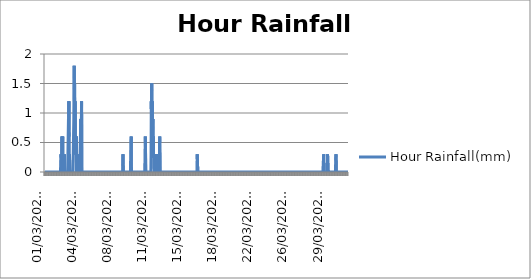
| Category | Hour Rainfall(mm) |
|---|---|
|  01/03/2022 00:20:09 | 0 |
|  01/03/2022 00:50:09 | 0 |
|  01/03/2022 01:20:09 | 0 |
|  01/03/2022 01:50:09 | 0 |
|  01/03/2022 02:20:09 | 0 |
|  01/03/2022 02:50:09 | 0 |
|  01/03/2022 03:20:09 | 0 |
|  01/03/2022 03:50:09 | 0 |
|  01/03/2022 04:20:09 | 0 |
|  01/03/2022 04:50:09 | 0 |
|  01/03/2022 05:20:09 | 0 |
|  01/03/2022 05:50:09 | 0 |
|  01/03/2022 06:20:09 | 0 |
|  01/03/2022 06:50:09 | 0 |
|  01/03/2022 07:20:09 | 0 |
|  01/03/2022 07:50:09 | 0 |
|  01/03/2022 08:20:09 | 0 |
|  01/03/2022 08:50:09 | 0 |
|  01/03/2022 09:20:09 | 0 |
|  01/03/2022 09:50:09 | 0 |
|  01/03/2022 10:20:09 | 0 |
|  01/03/2022 10:50:09 | 0 |
|  01/03/2022 11:20:09 | 0 |
|  01/03/2022 11:50:09 | 0 |
|  01/03/2022 12:20:09 | 0 |
|  01/03/2022 12:50:09 | 0 |
|  01/03/2022 15:54:06 | 0 |
|  01/03/2022 16:24:06 | 0 |
|  01/03/2022 16:54:06 | 0 |
|  01/03/2022 17:24:06 | 0 |
|  01/03/2022 17:54:06 | 0 |
|  01/03/2022 18:24:06 | 0 |
|  01/03/2022 18:54:06 | 0 |
|  01/03/2022 19:24:06 | 0 |
|  01/03/2022 19:54:06 | 0 |
|  01/03/2022 20:24:06 | 0 |
|  01/03/2022 20:54:06 | 0 |
|  01/03/2022 21:24:06 | 0 |
|  01/03/2022 21:54:06 | 0 |
|  01/03/2022 22:24:06 | 0 |
|  01/03/2022 22:54:06 | 0 |
|  01/03/2022 23:24:06 | 0 |
|  01/03/2022 23:54:06 | 0 |
|  02/03/2022 00:24:06 | 0 |
|  02/03/2022 00:54:06 | 0 |
|  02/03/2022 01:24:06 | 0 |
|  02/03/2022 01:54:06 | 0 |
|  02/03/2022 02:24:06 | 0 |
|  02/03/2022 02:54:06 | 0 |
|  02/03/2022 03:24:06 | 0 |
|  02/03/2022 03:54:06 | 0 |
|  02/03/2022 04:24:06 | 0 |
|  02/03/2022 04:54:06 | 0 |
|  02/03/2022 05:24:06 | 0 |
|  02/03/2022 05:54:06 | 0 |
|  02/03/2022 06:24:06 | 0 |
|  02/03/2022 06:54:06 | 0 |
|  02/03/2022 07:24:06 | 0 |
|  02/03/2022 07:54:06 | 0 |
|  02/03/2022 08:24:06 | 0 |
|  02/03/2022 08:54:06 | 0 |
|  02/03/2022 09:24:06 | 0 |
|  02/03/2022 09:54:06 | 0 |
|  02/03/2022 10:24:06 | 0 |
|  02/03/2022 10:54:06 | 0 |
|  02/03/2022 11:24:06 | 0 |
|  02/03/2022 11:54:06 | 0 |
|  02/03/2022 12:24:06 | 0 |
|  02/03/2022 12:54:06 | 0 |
|  02/03/2022 13:24:06 | 0 |
|  02/03/2022 13:54:06 | 0 |
|  02/03/2022 14:24:06 | 0 |
|  02/03/2022 14:54:06 | 0 |
|  02/03/2022 15:24:06 | 0 |
|  02/03/2022 15:54:06 | 0 |
|  02/03/2022 16:24:06 | 0 |
|  02/03/2022 16:54:06 | 0 |
|  02/03/2022 17:24:06 | 0 |
|  02/03/2022 17:54:06 | 0.3 |
|  02/03/2022 18:24:06 | 0 |
|  02/03/2022 18:54:06 | 0 |
|  02/03/2022 19:24:06 | 0.3 |
|  02/03/2022 19:54:06 | 0.6 |
|  02/03/2022 20:24:06 | 0 |
|  02/03/2022 20:54:06 | 0.3 |
|  02/03/2022 21:24:06 | 0.3 |
|  02/03/2022 21:54:06 | 0.6 |
|  02/03/2022 22:24:06 | 0 |
|  02/03/2022 22:54:06 | 0 |
|  02/03/2022 23:24:06 | 0 |
|  02/03/2022 23:54:06 | 0 |
|  03/03/2022 00:24:06 | 0 |
|  03/03/2022 00:54:06 | 0 |
|  03/03/2022 01:24:06 | 0 |
|  03/03/2022 01:54:06 | 0.3 |
|  03/03/2022 02:24:06 | 0 |
|  03/03/2022 02:54:06 | 0 |
|  03/03/2022 03:24:06 | 0 |
|  03/03/2022 03:54:06 | 0 |
|  03/03/2022 04:24:06 | 0 |
|  03/03/2022 04:54:06 | 0 |
|  03/03/2022 05:24:06 | 0 |
|  03/03/2022 05:54:06 | 0 |
|  03/03/2022 06:24:06 | 0 |
|  03/03/2022 06:54:06 | 0 |
|  03/03/2022 07:24:06 | 0 |
|  03/03/2022 07:54:06 | 0 |
|  03/03/2022 08:24:06 | 0 |
|  03/03/2022 08:54:06 | 0 |
|  03/03/2022 09:24:06 | 0 |
|  03/03/2022 09:54:06 | 0 |
|  03/03/2022 10:24:06 | 0 |
|  03/03/2022 10:54:06 | 0 |
|  03/03/2022 11:24:06 | 0 |
|  03/03/2022 11:54:06 | 0.9 |
|  03/03/2022 12:24:06 | 0.6 |
|  03/03/2022 12:54:06 | 1.2 |
|  03/03/2022 13:24:06 | 0 |
|  03/03/2022 13:54:06 | 0 |
|  03/03/2022 14:24:06 | 0.3 |
|  03/03/2022 14:54:06 | 0.3 |
|  03/03/2022 15:24:06 | 0 |
|  03/03/2022 15:54:06 | 0 |
|  03/03/2022 16:24:06 | 0 |
|  03/03/2022 16:54:06 | 0 |
|  03/03/2022 17:24:06 | 0 |
|  03/03/2022 17:54:06 | 0 |
|  03/03/2022 18:24:06 | 0 |
|  03/03/2022 18:54:06 | 0 |
|  03/03/2022 19:24:06 | 0 |
|  03/03/2022 19:54:06 | 0 |
|  03/03/2022 20:24:06 | 0 |
|  03/03/2022 20:54:06 | 0 |
|  03/03/2022 21:24:06 | 0 |
|  03/03/2022 21:54:06 | 0 |
|  03/03/2022 22:24:06 | 0 |
|  03/03/2022 22:54:06 | 0 |
|  03/03/2022 23:24:06 | 0 |
|  03/03/2022 23:54:06 | 0 |
|  04/03/2022 00:24:06 | 0 |
|  04/03/2022 00:54:06 | 0.9 |
|  04/03/2022 01:24:06 | 0.9 |
|  04/03/2022 01:54:06 | 1.8 |
|  04/03/2022 02:24:06 | 1.2 |
|  04/03/2022 02:54:06 | 1.5 |
|  04/03/2022 03:24:06 | 0.3 |
|  04/03/2022 03:54:06 | 1.2 |
|  04/03/2022 04:24:06 | 0.6 |
|  04/03/2022 04:54:06 | 0.6 |
|  04/03/2022 05:24:06 | 0.3 |
|  04/03/2022 05:54:06 | 0.6 |
|  04/03/2022 06:24:06 | 0.3 |
|  04/03/2022 06:54:06 | 0.6 |
|  04/03/2022 07:24:06 | 0 |
|  04/03/2022 07:54:06 | 0.3 |
|  04/03/2022 08:24:06 | 0 |
|  04/03/2022 08:54:06 | 0 |
|  04/03/2022 09:24:06 | 0 |
|  04/03/2022 09:54:06 | 0.3 |
|  04/03/2022 10:24:06 | 0 |
|  04/03/2022 10:54:06 | 0 |
|  04/03/2022 11:24:06 | 0 |
|  04/03/2022 11:54:06 | 0 |
|  04/03/2022 12:24:06 | 0 |
|  04/03/2022 12:54:06 | 0 |
|  04/03/2022 13:24:06 | 0 |
|  04/03/2022 13:54:06 | 0 |
|  04/03/2022 14:24:06 | 0 |
|  04/03/2022 14:54:06 | 0 |
|  04/03/2022 15:24:06 | 0 |
|  04/03/2022 15:54:06 | 0 |
|  04/03/2022 16:24:06 | 0 |
|  04/03/2022 16:54:06 | 0 |
|  04/03/2022 17:24:06 | 0 |
|  04/03/2022 17:54:06 | 0.9 |
|  04/03/2022 18:24:06 | 0.3 |
|  04/03/2022 18:54:06 | 0.3 |
|  04/03/2022 19:24:06 | 0.9 |
|  04/03/2022 19:54:06 | 1.2 |
|  04/03/2022 20:24:06 | 0 |
|  04/03/2022 20:54:06 | 0 |
|  04/03/2022 21:24:06 | 0 |
|  04/03/2022 21:54:06 | 0 |
|  04/03/2022 22:24:06 | 0 |
|  04/03/2022 22:54:06 | 0 |
|  04/03/2022 23:24:06 | 0 |
|  04/03/2022 23:54:06 | 0 |
|  05/03/2022 00:24:06 | 0 |
|  05/03/2022 00:54:06 | 0 |
|  05/03/2022 01:24:06 | 0 |
|  05/03/2022 01:54:06 | 0 |
|  05/03/2022 02:24:06 | 0 |
|  05/03/2022 02:54:06 | 0 |
|  05/03/2022 03:24:06 | 0 |
|  05/03/2022 03:54:06 | 0 |
|  05/03/2022 04:24:06 | 0 |
|  05/03/2022 04:54:06 | 0 |
|  05/03/2022 05:24:06 | 0 |
|  05/03/2022 05:54:06 | 0 |
|  05/03/2022 06:24:06 | 0 |
|  05/03/2022 06:54:06 | 0 |
|  05/03/2022 07:24:06 | 0 |
|  05/03/2022 07:54:06 | 0 |
|  05/03/2022 08:24:06 | 0 |
|  05/03/2022 08:54:06 | 0 |
|  05/03/2022 09:24:06 | 0 |
|  05/03/2022 09:54:06 | 0 |
|  05/03/2022 10:24:06 | 0 |
|  05/03/2022 10:54:06 | 0 |
|  05/03/2022 11:24:06 | 0 |
|  05/03/2022 11:54:06 | 0 |
|  05/03/2022 12:24:06 | 0 |
|  05/03/2022 12:54:06 | 0 |
|  05/03/2022 13:24:06 | 0 |
|  05/03/2022 13:54:06 | 0 |
|  05/03/2022 14:24:06 | 0 |
|  05/03/2022 14:54:06 | 0 |
|  05/03/2022 15:24:06 | 0 |
|  05/03/2022 15:54:06 | 0 |
|  05/03/2022 16:24:06 | 0 |
|  05/03/2022 16:54:06 | 0 |
|  05/03/2022 17:24:06 | 0 |
|  05/03/2022 17:54:06 | 0 |
|  05/03/2022 18:24:06 | 0 |
|  05/03/2022 18:54:06 | 0 |
|  05/03/2022 19:24:06 | 0 |
|  05/03/2022 19:54:06 | 0 |
|  05/03/2022 20:24:06 | 0 |
|  05/03/2022 20:54:06 | 0 |
|  05/03/2022 21:24:06 | 0 |
|  05/03/2022 21:54:06 | 0 |
|  05/03/2022 22:24:06 | 0 |
|  05/03/2022 22:54:06 | 0 |
|  05/03/2022 23:24:06 | 0 |
|  05/03/2022 23:54:06 | 0 |
|  06/03/2022 00:24:06 | 0 |
|  06/03/2022 00:54:06 | 0 |
|  06/03/2022 01:24:06 | 0 |
|  06/03/2022 01:54:06 | 0 |
|  06/03/2022 02:24:06 | 0 |
|  06/03/2022 02:54:06 | 0 |
|  06/03/2022 03:24:06 | 0 |
|  06/03/2022 03:54:06 | 0 |
|  06/03/2022 04:24:06 | 0 |
|  06/03/2022 04:54:06 | 0 |
|  06/03/2022 05:24:06 | 0 |
|  06/03/2022 05:54:06 | 0 |
|  06/03/2022 06:24:06 | 0 |
|  06/03/2022 06:54:06 | 0 |
|  06/03/2022 07:24:06 | 0 |
|  06/03/2022 07:54:06 | 0 |
|  06/03/2022 08:24:06 | 0 |
|  06/03/2022 08:54:06 | 0 |
|  06/03/2022 09:24:06 | 0 |
|  06/03/2022 09:54:06 | 0 |
|  06/03/2022 10:24:06 | 0 |
|  06/03/2022 10:54:06 | 0 |
|  06/03/2022 11:24:06 | 0 |
|  06/03/2022 11:54:06 | 0 |
|  06/03/2022 12:24:06 | 0 |
|  06/03/2022 12:54:06 | 0 |
|  06/03/2022 13:24:06 | 0 |
|  06/03/2022 13:54:06 | 0 |
|  06/03/2022 14:24:06 | 0 |
|  06/03/2022 14:54:06 | 0 |
|  06/03/2022 15:24:06 | 0 |
|  06/03/2022 15:54:06 | 0 |
|  06/03/2022 16:24:06 | 0 |
|  06/03/2022 16:54:06 | 0 |
|  06/03/2022 17:24:06 | 0 |
|  06/03/2022 17:54:06 | 0 |
|  06/03/2022 18:24:06 | 0 |
|  06/03/2022 18:54:06 | 0 |
|  06/03/2022 19:24:06 | 0 |
|  06/03/2022 19:54:06 | 0 |
|  06/03/2022 20:24:06 | 0 |
|  06/03/2022 20:54:06 | 0 |
|  06/03/2022 21:24:06 | 0 |
|  06/03/2022 21:54:06 | 0 |
|  06/03/2022 22:24:06 | 0 |
|  06/03/2022 22:54:06 | 0 |
|  06/03/2022 23:24:06 | 0 |
|  06/03/2022 23:54:06 | 0 |
|  07/03/2022 00:24:06 | 0 |
|  07/03/2022 00:54:06 | 0 |
|  07/03/2022 01:24:06 | 0 |
|  07/03/2022 01:54:06 | 0 |
|  07/03/2022 02:24:06 | 0 |
|  07/03/2022 02:54:06 | 0 |
|  07/03/2022 03:24:06 | 0 |
|  07/03/2022 03:54:06 | 0 |
|  07/03/2022 04:24:06 | 0 |
|  07/03/2022 04:54:06 | 0 |
|  07/03/2022 05:24:06 | 0 |
|  07/03/2022 05:54:06 | 0 |
|  07/03/2022 06:24:06 | 0 |
|  07/03/2022 06:54:06 | 0 |
|  07/03/2022 07:24:06 | 0 |
|  07/03/2022 07:54:06 | 0 |
|  07/03/2022 08:24:06 | 0 |
|  07/03/2022 08:54:06 | 0 |
|  07/03/2022 09:24:06 | 0 |
|  07/03/2022 09:54:06 | 0 |
|  07/03/2022 10:24:06 | 0 |
|  07/03/2022 10:54:06 | 0 |
|  07/03/2022 11:24:06 | 0 |
|  07/03/2022 11:54:06 | 0 |
|  07/03/2022 12:24:06 | 0 |
|  07/03/2022 12:54:06 | 0 |
|  07/03/2022 13:24:06 | 0 |
|  07/03/2022 13:54:06 | 0 |
|  07/03/2022 14:24:06 | 0 |
|  07/03/2022 14:54:06 | 0 |
|  07/03/2022 15:24:06 | 0 |
|  07/03/2022 15:54:06 | 0 |
|  07/03/2022 16:24:06 | 0 |
|  07/03/2022 16:54:06 | 0 |
|  07/03/2022 17:24:06 | 0 |
|  07/03/2022 17:54:06 | 0 |
|  07/03/2022 18:24:06 | 0 |
|  07/03/2022 18:54:06 | 0 |
|  07/03/2022 19:24:06 | 0 |
|  07/03/2022 19:54:06 | 0 |
|  07/03/2022 20:24:06 | 0 |
|  07/03/2022 20:54:06 | 0 |
|  07/03/2022 21:24:06 | 0 |
|  07/03/2022 21:54:06 | 0 |
|  07/03/2022 22:24:06 | 0 |
|  07/03/2022 22:54:06 | 0 |
|  07/03/2022 23:24:06 | 0 |
|  07/03/2022 23:54:06 | 0 |
|  08/03/2022 00:24:06 | 0 |
|  08/03/2022 00:54:06 | 0 |
|  08/03/2022 01:24:06 | 0 |
|  08/03/2022 01:54:06 | 0 |
|  08/03/2022 02:24:06 | 0 |
|  08/03/2022 02:54:06 | 0 |
|  08/03/2022 03:24:06 | 0 |
|  08/03/2022 03:54:06 | 0 |
|  08/03/2022 04:24:06 | 0 |
|  08/03/2022 04:54:06 | 0 |
|  08/03/2022 05:24:06 | 0 |
|  08/03/2022 05:54:06 | 0 |
|  08/03/2022 06:24:06 | 0 |
|  08/03/2022 06:54:06 | 0 |
|  08/03/2022 07:24:06 | 0 |
|  08/03/2022 07:54:06 | 0 |
|  08/03/2022 08:24:06 | 0 |
|  08/03/2022 08:54:06 | 0 |
|  08/03/2022 09:24:06 | 0 |
|  08/03/2022 09:54:06 | 0 |
|  08/03/2022 10:24:06 | 0 |
|  08/03/2022 10:54:06 | 0 |
|  08/03/2022 11:24:06 | 0 |
|  08/03/2022 11:54:06 | 0 |
|  08/03/2022 12:24:06 | 0 |
|  08/03/2022 12:54:06 | 0 |
|  08/03/2022 13:24:06 | 0 |
|  08/03/2022 13:54:06 | 0 |
|  08/03/2022 14:24:06 | 0 |
|  08/03/2022 14:54:06 | 0 |
|  08/03/2022 15:24:06 | 0 |
|  08/03/2022 15:54:06 | 0 |
|  08/03/2022 16:24:06 | 0 |
|  08/03/2022 16:54:06 | 0 |
|  08/03/2022 17:24:06 | 0 |
|  08/03/2022 17:54:06 | 0 |
|  08/03/2022 18:24:06 | 0 |
|  08/03/2022 18:54:06 | 0 |
|  08/03/2022 19:24:06 | 0 |
|  08/03/2022 19:54:06 | 0 |
|  08/03/2022 20:24:06 | 0 |
|  08/03/2022 20:54:06 | 0 |
|  08/03/2022 21:24:06 | 0 |
|  08/03/2022 21:54:06 | 0 |
|  08/03/2022 22:24:06 | 0 |
|  08/03/2022 22:54:06 | 0 |
|  08/03/2022 23:24:06 | 0 |
|  08/03/2022 23:54:06 | 0 |
|  09/03/2022 00:24:06 | 0 |
|  09/03/2022 00:54:06 | 0.3 |
|  09/03/2022 01:24:06 | 0 |
|  09/03/2022 01:54:06 | 0 |
|  09/03/2022 02:24:06 | 0 |
|  09/03/2022 02:54:06 | 0 |
|  09/03/2022 03:24:06 | 0 |
|  09/03/2022 03:54:06 | 0 |
|  09/03/2022 04:24:06 | 0 |
|  09/03/2022 04:54:06 | 0 |
|  09/03/2022 05:24:06 | 0 |
|  09/03/2022 05:54:06 | 0 |
|  09/03/2022 06:24:06 | 0 |
|  09/03/2022 06:54:06 | 0 |
|  09/03/2022 07:24:06 | 0 |
|  09/03/2022 07:54:06 | 0 |
|  09/03/2022 08:24:06 | 0 |
|  09/03/2022 08:54:06 | 0 |
|  09/03/2022 09:24:06 | 0 |
|  09/03/2022 09:54:06 | 0 |
|  09/03/2022 10:24:06 | 0 |
|  09/03/2022 10:54:06 | 0 |
|  09/03/2022 11:24:06 | 0 |
|  09/03/2022 11:54:06 | 0 |
|  09/03/2022 12:24:06 | 0 |
|  09/03/2022 12:54:06 | 0 |
|  09/03/2022 13:24:06 | 0 |
|  09/03/2022 13:54:06 | 0 |
|  09/03/2022 14:24:06 | 0 |
|  09/03/2022 14:54:06 | 0 |
|  09/03/2022 15:24:06 | 0 |
|  09/03/2022 15:54:06 | 0 |
|  09/03/2022 16:24:06 | 0 |
|  09/03/2022 16:54:06 | 0 |
|  09/03/2022 17:24:06 | 0 |
|  09/03/2022 17:54:06 | 0 |
|  09/03/2022 18:24:06 | 0 |
|  09/03/2022 18:54:06 | 0 |
|  09/03/2022 19:24:06 | 0 |
|  09/03/2022 19:54:06 | 0 |
|  09/03/2022 20:24:06 | 0 |
|  09/03/2022 20:54:06 | 0.6 |
|  09/03/2022 21:24:06 | 0 |
|  09/03/2022 21:54:06 | 0 |
|  09/03/2022 22:24:06 | 0 |
|  09/03/2022 22:54:06 | 0 |
|  09/03/2022 23:24:06 | 0 |
|  09/03/2022 23:54:06 | 0 |
|  10/03/2022 00:24:06 | 0 |
|  10/03/2022 00:54:06 | 0 |
|  10/03/2022 01:24:06 | 0 |
|  10/03/2022 01:54:06 | 0 |
|  10/03/2022 02:24:06 | 0 |
|  10/03/2022 02:54:06 | 0 |
|  10/03/2022 03:24:06 | 0 |
|  10/03/2022 03:54:06 | 0 |
|  10/03/2022 04:24:06 | 0 |
|  10/03/2022 04:54:06 | 0 |
|  10/03/2022 05:24:06 | 0 |
|  10/03/2022 05:54:06 | 0 |
|  10/03/2022 06:24:06 | 0 |
|  10/03/2022 06:54:06 | 0 |
|  10/03/2022 07:24:06 | 0 |
|  10/03/2022 07:54:06 | 0 |
|  10/03/2022 08:24:06 | 0 |
|  10/03/2022 08:54:06 | 0 |
|  10/03/2022 09:24:06 | 0 |
|  10/03/2022 09:54:06 | 0 |
|  10/03/2022 10:24:06 | 0 |
|  10/03/2022 10:54:06 | 0 |
|  10/03/2022 11:24:06 | 0 |
|  10/03/2022 11:54:06 | 0 |
|  10/03/2022 12:24:06 | 0 |
|  10/03/2022 12:54:06 | 0 |
|  10/03/2022 13:24:06 | 0 |
|  10/03/2022 13:54:06 | 0 |
|  10/03/2022 14:24:06 | 0 |
|  10/03/2022 14:54:06 | 0 |
|  10/03/2022 15:24:06 | 0 |
|  10/03/2022 15:54:06 | 0 |
|  10/03/2022 16:24:06 | 0 |
|  10/03/2022 16:54:06 | 0 |
|  10/03/2022 17:24:06 | 0 |
|  10/03/2022 17:54:06 | 0 |
|  10/03/2022 18:24:06 | 0 |
|  10/03/2022 18:54:06 | 0 |
|  10/03/2022 19:24:06 | 0 |
|  10/03/2022 19:54:06 | 0 |
|  10/03/2022 20:24:06 | 0 |
|  10/03/2022 20:54:06 | 0 |
|  10/03/2022 21:24:06 | 0 |
|  10/03/2022 21:54:06 | 0 |
|  10/03/2022 22:24:06 | 0 |
|  10/03/2022 22:54:06 | 0 |
|  10/03/2022 23:24:06 | 0 |
|  10/03/2022 23:54:06 | 0 |
|  11/03/2022 00:24:06 | 0 |
|  11/03/2022 00:54:06 | 0 |
|  11/03/2022 01:24:06 | 0 |
|  11/03/2022 01:54:06 | 0 |
|  11/03/2022 02:24:06 | 0 |
|  11/03/2022 02:54:06 | 0 |
|  11/03/2022 03:24:06 | 0 |
|  11/03/2022 03:54:06 | 0 |
|  11/03/2022 04:24:06 | 0 |
|  11/03/2022 04:54:06 | 0 |
|  11/03/2022 05:24:06 | 0 |
|  11/03/2022 05:54:06 | 0 |
|  11/03/2022 06:24:06 | 0 |
|  11/03/2022 06:54:06 | 0 |
|  11/03/2022 07:24:06 | 0.6 |
|  11/03/2022 07:54:06 | 0.6 |
|  11/03/2022 08:24:06 | 0 |
|  11/03/2022 08:54:06 | 0 |
|  11/03/2022 09:24:06 | 0 |
|  11/03/2022 09:54:06 | 0 |
|  11/03/2022 10:24:06 | 0 |
|  11/03/2022 10:54:06 | 0 |
|  11/03/2022 11:24:06 | 0 |
|  11/03/2022 11:54:06 | 0 |
|  11/03/2022 12:24:06 | 0 |
|  11/03/2022 12:54:06 | 0 |
|  11/03/2022 13:24:06 | 0 |
|  11/03/2022 13:54:06 | 0 |
|  11/03/2022 14:24:06 | 0 |
|  11/03/2022 14:54:06 | 0 |
|  11/03/2022 15:24:06 | 0 |
|  11/03/2022 15:54:06 | 0 |
|  11/03/2022 16:24:06 | 0 |
|  11/03/2022 16:54:06 | 0 |
|  11/03/2022 17:24:06 | 0 |
|  11/03/2022 17:54:06 | 0 |
|  11/03/2022 18:24:06 | 0 |
|  11/03/2022 18:54:06 | 0 |
|  11/03/2022 19:24:06 | 0 |
|  11/03/2022 19:54:06 | 0 |
|  11/03/2022 20:24:06 | 0 |
|  11/03/2022 20:54:06 | 0 |
|  11/03/2022 21:24:06 | 0.3 |
|  11/03/2022 21:54:06 | 1.2 |
|  11/03/2022 22:24:06 | 0.9 |
|  11/03/2022 22:54:06 | 1.5 |
|  11/03/2022 23:24:06 | 0.6 |
|  11/03/2022 23:54:06 | 1.2 |
|  12/03/2022 00:24:06 | 0.3 |
|  12/03/2022 00:54:06 | 0.6 |
|  12/03/2022 01:24:06 | 0.6 |
|  12/03/2022 01:54:06 | 0.9 |
|  12/03/2022 02:24:06 | 0.3 |
|  12/03/2022 02:54:06 | 0.6 |
|  12/03/2022 03:24:06 | 0.3 |
|  12/03/2022 03:54:06 | 0.3 |
|  12/03/2022 04:24:06 | 0 |
|  12/03/2022 04:54:06 | 0 |
|  12/03/2022 05:24:06 | 0 |
|  12/03/2022 05:54:06 | 0 |
|  12/03/2022 06:24:06 | 0 |
|  12/03/2022 06:54:06 | 0 |
|  12/03/2022 07:24:06 | 0 |
|  12/03/2022 07:54:06 | 0 |
|  12/03/2022 08:24:06 | 0 |
|  12/03/2022 08:54:06 | 0 |
|  12/03/2022 09:24:06 | 0 |
|  12/03/2022 09:54:06 | 0.3 |
|  12/03/2022 10:24:06 | 0 |
|  12/03/2022 10:54:06 | 0 |
|  12/03/2022 11:24:06 | 0.3 |
|  12/03/2022 11:54:06 | 0.3 |
|  12/03/2022 12:24:06 | 0 |
|  12/03/2022 12:54:06 | 0 |
|  12/03/2022 13:24:06 | 0 |
|  12/03/2022 13:54:06 | 0 |
|  12/03/2022 14:24:06 | 0 |
|  12/03/2022 14:54:06 | 0 |
|  12/03/2022 15:24:06 | 0 |
|  12/03/2022 15:54:06 | 0 |
|  12/03/2022 16:24:06 | 0 |
|  12/03/2022 16:54:06 | 0 |
|  12/03/2022 17:24:06 | 0 |
|  12/03/2022 17:54:06 | 0 |
|  12/03/2022 18:24:06 | 0.6 |
|  12/03/2022 18:54:06 | 0.6 |
|  12/03/2022 19:24:06 | 0 |
|  12/03/2022 19:54:06 | 0 |
|  12/03/2022 20:24:06 | 0 |
|  12/03/2022 20:54:06 | 0 |
|  12/03/2022 21:24:06 | 0 |
|  12/03/2022 21:54:06 | 0 |
|  12/03/2022 22:24:06 | 0 |
|  12/03/2022 22:54:06 | 0 |
|  12/03/2022 23:24:06 | 0 |
|  12/03/2022 23:54:06 | 0 |
|  13/03/2022 00:24:06 | 0 |
|  13/03/2022 00:54:06 | 0 |
|  13/03/2022 01:24:06 | 0 |
|  13/03/2022 01:54:06 | 0 |
|  13/03/2022 02:24:06 | 0 |
|  13/03/2022 02:54:06 | 0 |
|  13/03/2022 03:24:06 | 0 |
|  13/03/2022 03:54:06 | 0 |
|  13/03/2022 04:24:06 | 0 |
|  13/03/2022 04:54:06 | 0 |
|  13/03/2022 05:24:06 | 0 |
|  13/03/2022 05:54:06 | 0 |
|  13/03/2022 06:24:06 | 0 |
|  13/03/2022 06:54:06 | 0 |
|  13/03/2022 07:24:06 | 0 |
|  13/03/2022 07:54:06 | 0 |
|  13/03/2022 08:24:06 | 0 |
|  13/03/2022 08:54:06 | 0 |
|  13/03/2022 09:24:06 | 0 |
|  13/03/2022 09:54:06 | 0 |
|  13/03/2022 10:24:06 | 0 |
|  13/03/2022 10:54:06 | 0 |
|  13/03/2022 11:24:06 | 0 |
|  13/03/2022 11:54:06 | 0 |
|  13/03/2022 12:24:06 | 0 |
|  13/03/2022 12:54:06 | 0 |
|  13/03/2022 13:24:06 | 0 |
|  13/03/2022 13:54:06 | 0 |
|  13/03/2022 14:24:06 | 0 |
|  13/03/2022 14:54:06 | 0 |
|  13/03/2022 15:24:06 | 0 |
|  13/03/2022 15:54:06 | 0 |
|  13/03/2022 16:24:06 | 0 |
|  13/03/2022 16:54:06 | 0 |
|  13/03/2022 17:24:06 | 0 |
|  13/03/2022 17:54:06 | 0 |
|  13/03/2022 18:24:06 | 0 |
|  13/03/2022 18:54:06 | 0 |
|  13/03/2022 19:24:06 | 0 |
|  13/03/2022 19:54:06 | 0 |
|  13/03/2022 20:24:06 | 0 |
|  13/03/2022 20:54:06 | 0 |
|  13/03/2022 21:24:06 | 0 |
|  13/03/2022 21:54:06 | 0 |
|  13/03/2022 22:24:06 | 0 |
|  13/03/2022 22:54:06 | 0 |
|  13/03/2022 23:24:06 | 0 |
|  13/03/2022 23:54:06 | 0 |
|  14/03/2022 00:24:06 | 0 |
|  14/03/2022 00:54:06 | 0 |
|  14/03/2022 01:24:06 | 0 |
|  14/03/2022 01:54:06 | 0 |
|  14/03/2022 02:24:06 | 0 |
|  14/03/2022 02:54:06 | 0 |
|  14/03/2022 03:24:06 | 0 |
|  14/03/2022 03:54:06 | 0 |
|  14/03/2022 04:24:06 | 0 |
|  14/03/2022 04:54:06 | 0 |
|  14/03/2022 05:24:06 | 0 |
|  14/03/2022 05:54:06 | 0 |
|  14/03/2022 06:24:06 | 0 |
|  14/03/2022 06:54:06 | 0 |
|  14/03/2022 07:24:06 | 0 |
|  14/03/2022 07:54:06 | 0 |
|  14/03/2022 08:24:06 | 0 |
|  14/03/2022 08:54:06 | 0 |
|  14/03/2022 09:24:06 | 0 |
|  14/03/2022 09:54:06 | 0 |
|  14/03/2022 10:24:06 | 0 |
|  14/03/2022 10:54:06 | 0 |
|  14/03/2022 11:24:06 | 0 |
|  14/03/2022 11:54:06 | 0 |
|  14/03/2022 12:24:06 | 0 |
|  14/03/2022 12:54:06 | 0 |
|  14/03/2022 13:24:06 | 0 |
|  14/03/2022 13:54:06 | 0 |
|  14/03/2022 14:24:06 | 0 |
|  14/03/2022 14:54:06 | 0 |
|  14/03/2022 15:24:06 | 0 |
|  14/03/2022 15:54:06 | 0 |
|  14/03/2022 16:24:06 | 0 |
|  14/03/2022 16:54:06 | 0 |
|  14/03/2022 17:24:06 | 0 |
|  14/03/2022 17:54:06 | 0 |
|  14/03/2022 18:24:06 | 0 |
|  14/03/2022 18:54:06 | 0 |
|  14/03/2022 19:24:06 | 0 |
|  14/03/2022 19:54:06 | 0 |
|  14/03/2022 20:24:06 | 0 |
|  14/03/2022 20:54:06 | 0 |
|  14/03/2022 21:24:06 | 0 |
|  14/03/2022 21:54:06 | 0 |
|  14/03/2022 22:24:06 | 0 |
|  14/03/2022 22:54:06 | 0 |
|  14/03/2022 23:24:06 | 0 |
|  14/03/2022 23:54:06 | 0 |
|  15/03/2022 00:24:06 | 0 |
|  15/03/2022 00:54:06 | 0 |
|  15/03/2022 01:24:06 | 0 |
|  15/03/2022 01:54:06 | 0 |
|  15/03/2022 02:24:06 | 0 |
|  15/03/2022 02:54:06 | 0 |
|  15/03/2022 03:24:06 | 0 |
|  15/03/2022 03:54:06 | 0 |
|  15/03/2022 04:24:06 | 0 |
|  15/03/2022 04:54:06 | 0 |
|  15/03/2022 05:24:06 | 0 |
|  15/03/2022 05:54:06 | 0 |
|  15/03/2022 06:24:06 | 0 |
|  15/03/2022 06:54:06 | 0 |
|  15/03/2022 07:24:06 | 0 |
|  15/03/2022 07:54:06 | 0 |
|  15/03/2022 08:24:06 | 0 |
|  15/03/2022 08:54:06 | 0 |
|  15/03/2022 09:24:06 | 0 |
|  15/03/2022 09:54:06 | 0 |
|  15/03/2022 10:24:06 | 0 |
|  15/03/2022 10:54:06 | 0 |
|  15/03/2022 11:24:06 | 0 |
|  15/03/2022 11:54:06 | 0 |
|  15/03/2022 12:24:06 | 0 |
|  15/03/2022 12:54:06 | 0 |
|  15/03/2022 13:24:06 | 0 |
|  15/03/2022 13:54:06 | 0 |
|  15/03/2022 14:24:06 | 0 |
|  15/03/2022 14:54:06 | 0 |
|  15/03/2022 15:24:06 | 0 |
|  15/03/2022 15:54:06 | 0 |
|  15/03/2022 16:24:06 | 0 |
|  15/03/2022 16:54:06 | 0 |
|  15/03/2022 17:24:06 | 0 |
|  15/03/2022 17:54:06 | 0 |
|  15/03/2022 18:24:06 | 0 |
|  15/03/2022 18:54:06 | 0 |
|  15/03/2022 19:24:06 | 0 |
|  15/03/2022 19:54:06 | 0 |
|  15/03/2022 20:24:06 | 0 |
|  15/03/2022 20:54:06 | 0 |
|  15/03/2022 21:24:06 | 0 |
|  15/03/2022 21:54:06 | 0 |
|  15/03/2022 22:24:06 | 0 |
|  15/03/2022 22:54:06 | 0 |
|  15/03/2022 23:24:06 | 0 |
|  15/03/2022 23:54:06 | 0 |
|  16/03/2022 00:24:06 | 0 |
|  16/03/2022 00:54:06 | 0 |
|  16/03/2022 01:24:06 | 0 |
|  16/03/2022 01:54:06 | 0 |
|  16/03/2022 02:24:06 | 0 |
|  16/03/2022 02:54:06 | 0 |
|  16/03/2022 03:24:06 | 0 |
|  16/03/2022 03:54:06 | 0 |
|  16/03/2022 04:24:06 | 0 |
|  16/03/2022 04:54:06 | 0 |
|  16/03/2022 05:24:06 | 0 |
|  16/03/2022 05:54:06 | 0 |
|  16/03/2022 06:24:06 | 0 |
|  16/03/2022 06:54:06 | 0 |
|  16/03/2022 07:24:06 | 0 |
|  16/03/2022 07:54:06 | 0 |
|  16/03/2022 08:24:06 | 0 |
|  16/03/2022 08:54:06 | 0 |
|  16/03/2022 09:24:06 | 0 |
|  16/03/2022 09:54:06 | 0 |
|  16/03/2022 10:24:06 | 0 |
|  16/03/2022 10:54:06 | 0 |
|  16/03/2022 11:24:06 | 0 |
|  16/03/2022 11:54:06 | 0 |
|  16/03/2022 12:24:06 | 0 |
|  16/03/2022 12:54:06 | 0 |
|  16/03/2022 13:24:06 | 0 |
|  16/03/2022 13:54:06 | 0.3 |
|  16/03/2022 14:24:06 | 0.3 |
|  16/03/2022 14:54:06 | 0.3 |
|  16/03/2022 15:24:06 | 0 |
|  16/03/2022 15:54:06 | 0 |
|  16/03/2022 16:24:06 | 0 |
|  16/03/2022 16:54:06 | 0 |
|  16/03/2022 17:24:06 | 0 |
|  16/03/2022 17:54:06 | 0 |
|  16/03/2022 18:24:06 | 0 |
|  16/03/2022 18:54:06 | 0 |
|  16/03/2022 19:24:06 | 0 |
|  16/03/2022 19:54:06 | 0 |
|  16/03/2022 20:24:06 | 0 |
|  16/03/2022 20:54:06 | 0 |
|  16/03/2022 21:24:06 | 0 |
|  16/03/2022 21:54:06 | 0 |
|  16/03/2022 22:24:06 | 0 |
|  16/03/2022 22:54:06 | 0 |
|  16/03/2022 23:24:06 | 0 |
|  16/03/2022 23:54:06 | 0 |
|  17/03/2022 00:24:06 | 0 |
|  17/03/2022 00:54:06 | 0 |
|  17/03/2022 01:24:06 | 0 |
|  17/03/2022 01:54:06 | 0 |
|  17/03/2022 02:24:06 | 0 |
|  17/03/2022 02:54:06 | 0 |
|  17/03/2022 03:24:06 | 0 |
|  17/03/2022 03:54:06 | 0 |
|  17/03/2022 04:24:06 | 0 |
|  17/03/2022 04:54:06 | 0 |
|  17/03/2022 05:24:06 | 0 |
|  17/03/2022 05:54:06 | 0 |
|  17/03/2022 06:24:06 | 0 |
|  17/03/2022 06:54:06 | 0 |
|  17/03/2022 07:24:06 | 0 |
|  17/03/2022 07:54:06 | 0 |
|  17/03/2022 08:24:06 | 0 |
|  17/03/2022 08:54:06 | 0 |
|  17/03/2022 09:24:06 | 0 |
|  17/03/2022 09:54:06 | 0 |
|  17/03/2022 10:24:06 | 0 |
|  17/03/2022 10:54:06 | 0 |
|  17/03/2022 11:24:06 | 0 |
|  17/03/2022 11:54:06 | 0 |
|  17/03/2022 12:24:06 | 0 |
|  17/03/2022 12:54:06 | 0 |
|  17/03/2022 13:24:06 | 0 |
|  17/03/2022 13:54:06 | 0 |
|  17/03/2022 14:24:06 | 0 |
|  17/03/2022 14:54:06 | 0 |
|  17/03/2022 15:24:06 | 0 |
|  17/03/2022 15:54:06 | 0 |
|  17/03/2022 16:24:06 | 0 |
|  17/03/2022 16:54:06 | 0 |
|  17/03/2022 17:24:06 | 0 |
|  17/03/2022 17:54:06 | 0 |
|  17/03/2022 18:24:06 | 0 |
|  17/03/2022 18:54:06 | 0 |
|  17/03/2022 19:24:06 | 0 |
|  17/03/2022 19:54:06 | 0 |
|  17/03/2022 20:24:06 | 0 |
|  17/03/2022 20:54:06 | 0 |
|  17/03/2022 21:24:06 | 0 |
|  17/03/2022 21:54:06 | 0 |
|  17/03/2022 22:24:06 | 0 |
|  17/03/2022 22:54:06 | 0 |
|  17/03/2022 23:24:06 | 0 |
|  17/03/2022 23:54:06 | 0 |
|  18/03/2022 00:24:06 | 0 |
|  18/03/2022 00:54:06 | 0 |
|  18/03/2022 01:24:06 | 0 |
|  18/03/2022 01:54:06 | 0 |
|  18/03/2022 02:24:06 | 0 |
|  18/03/2022 02:54:06 | 0 |
|  18/03/2022 03:24:06 | 0 |
|  18/03/2022 03:54:06 | 0 |
|  18/03/2022 04:24:06 | 0 |
|  18/03/2022 04:54:06 | 0 |
|  18/03/2022 05:24:06 | 0 |
|  18/03/2022 05:54:06 | 0 |
|  18/03/2022 06:24:06 | 0 |
|  18/03/2022 06:54:06 | 0 |
|  18/03/2022 07:24:06 | 0 |
|  18/03/2022 07:54:06 | 0 |
|  18/03/2022 08:24:06 | 0 |
|  18/03/2022 08:54:06 | 0 |
|  18/03/2022 09:24:06 | 0 |
|  18/03/2022 09:54:06 | 0 |
|  18/03/2022 10:24:06 | 0 |
|  18/03/2022 10:54:06 | 0 |
|  18/03/2022 11:24:06 | 0 |
|  18/03/2022 11:54:06 | 0 |
|  18/03/2022 12:24:06 | 0 |
|  18/03/2022 12:54:06 | 0 |
|  18/03/2022 13:24:06 | 0 |
|  18/03/2022 13:54:06 | 0 |
|  18/03/2022 14:24:06 | 0 |
|  18/03/2022 14:54:06 | 0 |
|  18/03/2022 15:24:06 | 0 |
|  18/03/2022 15:54:06 | 0 |
|  18/03/2022 16:24:06 | 0 |
|  18/03/2022 16:54:06 | 0 |
|  18/03/2022 17:24:06 | 0 |
|  18/03/2022 17:54:06 | 0 |
|  18/03/2022 18:24:06 | 0 |
|  18/03/2022 18:54:06 | 0 |
|  18/03/2022 19:24:06 | 0 |
|  18/03/2022 19:54:06 | 0 |
|  18/03/2022 20:24:06 | 0 |
|  18/03/2022 20:54:06 | 0 |
|  18/03/2022 21:24:06 | 0 |
|  18/03/2022 21:54:06 | 0 |
|  18/03/2022 22:24:06 | 0 |
|  18/03/2022 22:54:06 | 0 |
|  18/03/2022 23:24:06 | 0 |
|  18/03/2022 23:54:06 | 0 |
|  19/03/2022 00:24:06 | 0 |
|  19/03/2022 00:54:06 | 0 |
|  19/03/2022 01:24:06 | 0 |
|  19/03/2022 01:54:06 | 0 |
|  19/03/2022 02:24:06 | 0 |
|  19/03/2022 02:54:06 | 0 |
|  19/03/2022 03:24:06 | 0 |
|  19/03/2022 03:54:06 | 0 |
|  19/03/2022 04:24:06 | 0 |
|  19/03/2022 04:54:06 | 0 |
|  19/03/2022 05:24:06 | 0 |
|  19/03/2022 05:54:06 | 0 |
|  19/03/2022 06:24:06 | 0 |
|  19/03/2022 06:54:06 | 0 |
|  19/03/2022 07:24:06 | 0 |
|  19/03/2022 07:54:06 | 0 |
|  19/03/2022 08:24:06 | 0 |
|  19/03/2022 08:54:06 | 0 |
|  19/03/2022 09:24:06 | 0 |
|  19/03/2022 09:54:06 | 0 |
|  19/03/2022 10:24:06 | 0 |
|  19/03/2022 10:54:06 | 0 |
|  19/03/2022 11:24:06 | 0 |
|  19/03/2022 11:54:06 | 0 |
|  19/03/2022 12:24:06 | 0 |
|  19/03/2022 12:54:06 | 0 |
|  19/03/2022 13:24:06 | 0 |
|  19/03/2022 13:54:06 | 0 |
|  19/03/2022 14:24:06 | 0 |
|  19/03/2022 14:54:06 | 0 |
|  19/03/2022 15:24:06 | 0 |
|  19/03/2022 15:54:06 | 0 |
|  19/03/2022 16:24:06 | 0 |
|  19/03/2022 16:54:06 | 0 |
|  19/03/2022 17:24:06 | 0 |
|  19/03/2022 17:54:06 | 0 |
|  19/03/2022 18:24:06 | 0 |
|  19/03/2022 18:54:06 | 0 |
|  19/03/2022 19:24:06 | 0 |
|  19/03/2022 19:54:06 | 0 |
|  19/03/2022 20:24:06 | 0 |
|  19/03/2022 20:54:06 | 0 |
|  19/03/2022 21:24:06 | 0 |
|  19/03/2022 21:54:06 | 0 |
|  19/03/2022 22:24:06 | 0 |
|  19/03/2022 22:54:06 | 0 |
|  19/03/2022 23:24:06 | 0 |
|  19/03/2022 23:54:06 | 0 |
|  20/03/2022 00:24:06 | 0 |
|  20/03/2022 00:54:06 | 0 |
|  20/03/2022 01:24:06 | 0 |
|  20/03/2022 01:54:06 | 0 |
|  20/03/2022 02:24:06 | 0 |
|  20/03/2022 02:54:06 | 0 |
|  20/03/2022 03:24:06 | 0 |
|  20/03/2022 03:54:06 | 0 |
|  20/03/2022 04:24:06 | 0 |
|  20/03/2022 04:54:06 | 0 |
|  20/03/2022 05:24:06 | 0 |
|  20/03/2022 05:54:06 | 0 |
|  20/03/2022 06:24:06 | 0 |
|  20/03/2022 06:54:06 | 0 |
|  20/03/2022 07:24:06 | 0 |
|  20/03/2022 07:54:06 | 0 |
|  20/03/2022 08:24:06 | 0 |
|  20/03/2022 08:54:06 | 0 |
|  20/03/2022 09:24:06 | 0 |
|  20/03/2022 09:54:06 | 0 |
|  20/03/2022 10:24:06 | 0 |
|  20/03/2022 10:54:06 | 0 |
|  20/03/2022 11:24:06 | 0 |
|  20/03/2022 11:54:06 | 0 |
|  20/03/2022 12:24:06 | 0 |
|  20/03/2022 12:54:06 | 0 |
|  20/03/2022 13:24:06 | 0 |
|  20/03/2022 13:54:06 | 0 |
|  20/03/2022 14:24:06 | 0 |
|  20/03/2022 14:54:06 | 0 |
|  20/03/2022 15:24:06 | 0 |
|  20/03/2022 15:54:06 | 0 |
|  20/03/2022 16:24:06 | 0 |
|  20/03/2022 16:54:06 | 0 |
|  20/03/2022 17:24:06 | 0 |
|  20/03/2022 17:54:06 | 0 |
|  20/03/2022 18:24:06 | 0 |
|  20/03/2022 18:54:06 | 0 |
|  20/03/2022 19:24:06 | 0 |
|  20/03/2022 19:54:06 | 0 |
|  20/03/2022 20:24:06 | 0 |
|  20/03/2022 20:54:06 | 0 |
|  20/03/2022 21:24:06 | 0 |
|  20/03/2022 21:54:06 | 0 |
|  20/03/2022 22:24:06 | 0 |
|  20/03/2022 22:54:06 | 0 |
|  20/03/2022 23:24:06 | 0 |
|  20/03/2022 23:54:06 | 0 |
|  21/03/2022 00:24:06 | 0 |
|  21/03/2022 00:54:06 | 0 |
|  21/03/2022 01:24:06 | 0 |
|  21/03/2022 01:54:06 | 0 |
|  21/03/2022 02:24:06 | 0 |
|  21/03/2022 02:54:06 | 0 |
|  21/03/2022 03:24:06 | 0 |
|  21/03/2022 03:54:06 | 0 |
|  21/03/2022 04:24:06 | 0 |
|  21/03/2022 04:54:06 | 0 |
|  21/03/2022 05:24:06 | 0 |
|  21/03/2022 05:54:06 | 0 |
|  21/03/2022 06:24:06 | 0 |
|  21/03/2022 06:54:06 | 0 |
|  21/03/2022 07:24:06 | 0 |
|  21/03/2022 07:54:06 | 0 |
|  21/03/2022 08:24:06 | 0 |
|  21/03/2022 08:54:06 | 0 |
|  21/03/2022 09:24:06 | 0 |
|  21/03/2022 09:54:06 | 0 |
|  21/03/2022 10:24:06 | 0 |
|  21/03/2022 10:54:06 | 0 |
|  21/03/2022 11:24:06 | 0 |
|  21/03/2022 11:54:06 | 0 |
|  21/03/2022 12:24:06 | 0 |
|  21/03/2022 12:54:06 | 0 |
|  21/03/2022 13:24:06 | 0 |
|  21/03/2022 13:54:06 | 0 |
|  21/03/2022 14:24:06 | 0 |
|  21/03/2022 14:54:06 | 0 |
|  21/03/2022 15:24:06 | 0 |
|  21/03/2022 15:54:06 | 0 |
|  21/03/2022 16:24:06 | 0 |
|  21/03/2022 16:54:06 | 0 |
|  21/03/2022 17:24:06 | 0 |
|  21/03/2022 17:54:06 | 0 |
|  21/03/2022 18:24:06 | 0 |
|  21/03/2022 18:54:06 | 0 |
|  21/03/2022 19:24:06 | 0 |
|  21/03/2022 19:54:06 | 0 |
|  21/03/2022 20:24:06 | 0 |
|  21/03/2022 20:54:06 | 0 |
|  21/03/2022 21:24:06 | 0 |
|  21/03/2022 21:54:06 | 0 |
|  21/03/2022 22:24:06 | 0 |
|  21/03/2022 22:54:06 | 0 |
|  21/03/2022 23:24:06 | 0 |
|  21/03/2022 23:54:06 | 0 |
|  22/03/2022 00:24:06 | 0 |
|  22/03/2022 00:54:06 | 0 |
|  22/03/2022 01:24:06 | 0 |
|  22/03/2022 01:54:06 | 0 |
|  22/03/2022 02:24:06 | 0 |
|  22/03/2022 02:54:06 | 0 |
|  22/03/2022 03:24:06 | 0 |
|  22/03/2022 03:54:06 | 0 |
|  22/03/2022 04:24:06 | 0 |
|  22/03/2022 04:54:06 | 0 |
|  22/03/2022 05:25:06 | 0 |
|  22/03/2022 05:55:06 | 0 |
|  22/03/2022 06:25:06 | 0 |
|  22/03/2022 06:55:06 | 0 |
|  22/03/2022 07:25:06 | 0 |
|  22/03/2022 07:55:06 | 0 |
|  22/03/2022 08:25:06 | 0 |
|  22/03/2022 08:55:06 | 0 |
|  22/03/2022 09:25:06 | 0 |
|  22/03/2022 09:55:06 | 0 |
|  22/03/2022 10:25:06 | 0 |
|  22/03/2022 10:55:06 | 0 |
|  22/03/2022 11:25:06 | 0 |
|  22/03/2022 11:55:06 | 0 |
|  22/03/2022 12:25:06 | 0 |
|  22/03/2022 12:55:06 | 0 |
|  22/03/2022 13:25:06 | 0 |
|  22/03/2022 13:55:06 | 0 |
|  22/03/2022 14:25:06 | 0 |
|  22/03/2022 14:55:06 | 0 |
|  22/03/2022 15:25:06 | 0 |
|  22/03/2022 15:55:06 | 0 |
|  22/03/2022 16:25:06 | 0 |
|  22/03/2022 16:55:06 | 0 |
|  22/03/2022 17:25:06 | 0 |
|  22/03/2022 17:55:06 | 0 |
|  22/03/2022 18:25:06 | 0 |
|  22/03/2022 18:55:06 | 0 |
|  22/03/2022 19:25:06 | 0 |
|  22/03/2022 19:55:06 | 0 |
|  22/03/2022 20:25:06 | 0 |
|  22/03/2022 20:55:06 | 0 |
|  22/03/2022 21:25:06 | 0 |
|  22/03/2022 21:55:06 | 0 |
|  22/03/2022 22:25:06 | 0 |
|  22/03/2022 22:55:06 | 0 |
|  22/03/2022 23:25:06 | 0 |
|  22/03/2022 23:55:06 | 0 |
|  23/03/2022 00:25:06 | 0 |
|  23/03/2022 00:55:06 | 0 |
|  23/03/2022 01:25:06 | 0 |
|  23/03/2022 01:55:06 | 0 |
|  23/03/2022 02:25:06 | 0 |
|  23/03/2022 02:55:06 | 0 |
|  23/03/2022 03:25:06 | 0 |
|  23/03/2022 03:55:06 | 0 |
|  23/03/2022 04:25:06 | 0 |
|  23/03/2022 04:55:06 | 0 |
|  23/03/2022 05:25:06 | 0 |
|  23/03/2022 05:55:06 | 0 |
|  23/03/2022 06:25:06 | 0 |
|  23/03/2022 06:55:06 | 0 |
|  23/03/2022 07:25:06 | 0 |
|  23/03/2022 07:55:06 | 0 |
|  23/03/2022 08:25:06 | 0 |
|  23/03/2022 08:55:06 | 0 |
|  23/03/2022 09:25:06 | 0 |
|  23/03/2022 09:55:06 | 0 |
|  23/03/2022 10:25:06 | 0 |
|  23/03/2022 10:55:06 | 0 |
|  23/03/2022 11:25:06 | 0 |
|  23/03/2022 11:55:06 | 0 |
|  23/03/2022 12:25:06 | 0 |
|  23/03/2022 12:55:06 | 0 |
|  23/03/2022 13:25:06 | 0 |
|  23/03/2022 13:55:06 | 0 |
|  23/03/2022 14:25:06 | 0 |
|  23/03/2022 14:55:06 | 0 |
|  23/03/2022 15:25:06 | 0 |
|  23/03/2022 15:55:06 | 0 |
|  23/03/2022 16:25:06 | 0 |
|  23/03/2022 16:55:06 | 0 |
|  23/03/2022 17:25:06 | 0 |
|  23/03/2022 17:55:06 | 0 |
|  23/03/2022 18:25:06 | 0 |
|  23/03/2022 18:55:06 | 0 |
|  23/03/2022 19:25:06 | 0 |
|  23/03/2022 19:55:06 | 0 |
|  23/03/2022 20:25:06 | 0 |
|  23/03/2022 20:55:06 | 0 |
|  23/03/2022 21:25:06 | 0 |
|  23/03/2022 21:55:06 | 0 |
|  23/03/2022 22:25:06 | 0 |
|  23/03/2022 22:55:06 | 0 |
|  23/03/2022 23:25:06 | 0 |
|  23/03/2022 23:55:06 | 0 |
|  24/03/2022 00:25:06 | 0 |
|  24/03/2022 00:55:06 | 0 |
|  24/03/2022 01:25:06 | 0 |
|  24/03/2022 01:55:06 | 0 |
|  24/03/2022 02:25:06 | 0 |
|  24/03/2022 02:55:06 | 0 |
|  24/03/2022 03:25:06 | 0 |
|  24/03/2022 03:55:06 | 0 |
|  24/03/2022 04:25:06 | 0 |
|  24/03/2022 04:55:06 | 0 |
|  24/03/2022 05:25:06 | 0 |
|  24/03/2022 05:55:06 | 0 |
|  24/03/2022 06:25:06 | 0 |
|  24/03/2022 06:55:06 | 0 |
|  24/03/2022 07:25:06 | 0 |
|  24/03/2022 07:55:06 | 0 |
|  24/03/2022 08:25:06 | 0 |
|  24/03/2022 08:55:06 | 0 |
|  24/03/2022 09:25:06 | 0 |
|  24/03/2022 09:55:06 | 0 |
|  24/03/2022 10:25:06 | 0 |
|  24/03/2022 10:55:06 | 0 |
|  24/03/2022 11:25:06 | 0 |
|  24/03/2022 11:55:06 | 0 |
|  24/03/2022 12:25:06 | 0 |
|  24/03/2022 12:55:06 | 0 |
|  24/03/2022 13:25:06 | 0 |
|  24/03/2022 13:55:06 | 0 |
|  24/03/2022 14:25:06 | 0 |
|  24/03/2022 14:55:06 | 0 |
|  24/03/2022 15:25:06 | 0 |
|  24/03/2022 15:55:06 | 0 |
|  24/03/2022 16:25:06 | 0 |
|  24/03/2022 16:55:06 | 0 |
|  24/03/2022 17:25:06 | 0 |
|  24/03/2022 17:55:06 | 0 |
|  24/03/2022 18:25:06 | 0 |
|  24/03/2022 18:55:06 | 0 |
|  24/03/2022 19:25:06 | 0 |
|  24/03/2022 19:55:06 | 0 |
|  24/03/2022 20:25:06 | 0 |
|  24/03/2022 20:55:06 | 0 |
|  24/03/2022 21:25:06 | 0 |
|  24/03/2022 21:55:06 | 0 |
|  24/03/2022 22:25:06 | 0 |
|  24/03/2022 22:55:06 | 0 |
|  24/03/2022 23:25:06 | 0 |
|  24/03/2022 23:55:06 | 0 |
|  25/03/2022 00:25:06 | 0 |
|  25/03/2022 00:55:06 | 0 |
|  25/03/2022 01:25:06 | 0 |
|  25/03/2022 01:55:06 | 0 |
|  25/03/2022 02:25:06 | 0 |
|  25/03/2022 02:55:06 | 0 |
|  25/03/2022 03:25:06 | 0 |
|  25/03/2022 03:55:06 | 0 |
|  25/03/2022 04:25:06 | 0 |
|  25/03/2022 04:55:06 | 0 |
|  25/03/2022 05:25:06 | 0 |
|  25/03/2022 05:55:06 | 0 |
|  25/03/2022 06:25:06 | 0 |
|  25/03/2022 06:55:06 | 0 |
|  25/03/2022 07:25:06 | 0 |
|  25/03/2022 07:55:06 | 0 |
|  25/03/2022 08:25:06 | 0 |
|  25/03/2022 08:55:06 | 0 |
|  25/03/2022 09:25:06 | 0 |
|  25/03/2022 09:55:06 | 0 |
|  25/03/2022 10:25:06 | 0 |
|  25/03/2022 10:55:06 | 0 |
|  25/03/2022 11:25:06 | 0 |
|  25/03/2022 11:55:06 | 0 |
|  25/03/2022 12:25:06 | 0 |
|  25/03/2022 12:55:06 | 0 |
|  25/03/2022 13:25:06 | 0 |
|  25/03/2022 13:55:06 | 0 |
|  25/03/2022 14:25:06 | 0 |
|  25/03/2022 14:55:06 | 0 |
|  25/03/2022 15:25:06 | 0 |
|  25/03/2022 15:55:06 | 0 |
|  25/03/2022 16:25:06 | 0 |
|  25/03/2022 16:55:06 | 0 |
|  25/03/2022 17:25:06 | 0 |
|  25/03/2022 17:55:06 | 0 |
|  25/03/2022 18:25:06 | 0 |
|  25/03/2022 18:55:06 | 0 |
|  25/03/2022 19:25:06 | 0 |
|  25/03/2022 19:55:06 | 0 |
|  25/03/2022 20:25:06 | 0 |
|  25/03/2022 20:55:06 | 0 |
|  25/03/2022 21:25:06 | 0 |
|  25/03/2022 21:55:06 | 0 |
|  25/03/2022 22:25:06 | 0 |
|  25/03/2022 22:55:06 | 0 |
|  25/03/2022 23:25:06 | 0 |
|  25/03/2022 23:55:06 | 0 |
|  26/03/2022 00:25:06 | 0 |
|  26/03/2022 00:55:06 | 0 |
|  26/03/2022 01:25:06 | 0 |
|  26/03/2022 01:55:06 | 0 |
|  26/03/2022 02:25:06 | 0 |
|  26/03/2022 02:55:06 | 0 |
|  26/03/2022 03:25:06 | 0 |
|  26/03/2022 03:55:06 | 0 |
|  26/03/2022 04:25:06 | 0 |
|  26/03/2022 04:55:06 | 0 |
|  26/03/2022 05:25:06 | 0 |
|  26/03/2022 05:55:06 | 0 |
|  26/03/2022 06:25:06 | 0 |
|  26/03/2022 06:55:06 | 0 |
|  26/03/2022 07:25:06 | 0 |
|  26/03/2022 07:55:06 | 0 |
|  26/03/2022 08:25:06 | 0 |
|  26/03/2022 08:55:06 | 0 |
|  26/03/2022 09:25:06 | 0 |
|  26/03/2022 09:55:06 | 0 |
|  26/03/2022 10:25:06 | 0 |
|  26/03/2022 10:55:06 | 0 |
|  26/03/2022 11:25:06 | 0 |
|  26/03/2022 11:55:06 | 0 |
|  26/03/2022 12:25:06 | 0 |
|  26/03/2022 12:55:06 | 0 |
|  26/03/2022 13:25:06 | 0 |
|  26/03/2022 13:55:06 | 0 |
|  26/03/2022 14:25:06 | 0 |
|  26/03/2022 14:55:06 | 0 |
|  26/03/2022 15:25:06 | 0 |
|  26/03/2022 15:55:06 | 0 |
|  26/03/2022 16:25:06 | 0 |
|  26/03/2022 16:55:06 | 0 |
|  26/03/2022 17:25:06 | 0 |
|  26/03/2022 17:55:06 | 0 |
|  26/03/2022 18:25:06 | 0 |
|  26/03/2022 18:55:06 | 0 |
|  26/03/2022 19:25:06 | 0 |
|  26/03/2022 19:55:06 | 0 |
|  26/03/2022 20:25:06 | 0 |
|  26/03/2022 20:55:06 | 0 |
|  26/03/2022 21:25:06 | 0 |
|  26/03/2022 21:55:06 | 0 |
|  26/03/2022 22:25:06 | 0 |
|  26/03/2022 22:55:06 | 0 |
|  26/03/2022 23:25:06 | 0 |
|  26/03/2022 23:55:06 | 0 |
|  27/03/2022 00:25:06 | 0 |
|  27/03/2022 00:55:06 | 0 |
|  27/03/2022 01:25:06 | 0 |
|  27/03/2022 01:55:06 | 0 |
|  27/03/2022 02:25:06 | 0 |
|  27/03/2022 02:55:06 | 0 |
|  27/03/2022 03:25:06 | 0 |
|  27/03/2022 03:55:06 | 0 |
|  27/03/2022 04:25:06 | 0 |
|  27/03/2022 04:55:06 | 0 |
|  27/03/2022 05:25:06 | 0 |
|  27/03/2022 05:55:06 | 0 |
|  27/03/2022 06:25:06 | 0 |
|  27/03/2022 06:55:06 | 0 |
|  27/03/2022 07:25:06 | 0 |
|  27/03/2022 07:55:06 | 0 |
|  27/03/2022 08:25:06 | 0 |
|  27/03/2022 08:55:06 | 0 |
|  27/03/2022 09:25:06 | 0 |
|  27/03/2022 09:55:06 | 0 |
|  27/03/2022 10:25:06 | 0 |
|  27/03/2022 10:55:06 | 0 |
|  27/03/2022 11:25:06 | 0 |
|  27/03/2022 11:55:06 | 0 |
|  27/03/2022 12:25:06 | 0 |
|  27/03/2022 12:55:06 | 0 |
|  27/03/2022 13:25:06 | 0 |
|  27/03/2022 13:55:06 | 0 |
|  27/03/2022 14:25:06 | 0 |
|  27/03/2022 14:55:06 | 0 |
|  27/03/2022 15:25:06 | 0 |
|  27/03/2022 15:55:06 | 0 |
|  27/03/2022 16:25:06 | 0 |
|  27/03/2022 16:55:06 | 0 |
|  27/03/2022 17:25:06 | 0 |
|  27/03/2022 17:55:06 | 0 |
|  27/03/2022 18:25:06 | 0 |
|  27/03/2022 18:55:06 | 0 |
|  27/03/2022 19:25:06 | 0 |
|  27/03/2022 19:55:06 | 0 |
|  27/03/2022 20:25:06 | 0 |
|  27/03/2022 20:55:06 | 0 |
|  27/03/2022 21:25:06 | 0 |
|  27/03/2022 21:55:06 | 0 |
|  27/03/2022 22:25:06 | 0 |
|  27/03/2022 22:55:06 | 0 |
|  27/03/2022 23:25:06 | 0 |
|  27/03/2022 23:55:06 | 0 |
|  28/03/2022 00:25:06 | 0 |
|  28/03/2022 00:55:06 | 0 |
|  28/03/2022 01:25:06 | 0 |
|  28/03/2022 01:55:06 | 0 |
|  28/03/2022 02:25:06 | 0 |
|  28/03/2022 02:55:06 | 0 |
|  28/03/2022 03:25:06 | 0 |
|  28/03/2022 03:55:06 | 0 |
|  28/03/2022 04:25:06 | 0 |
|  28/03/2022 04:55:06 | 0 |
|  28/03/2022 05:25:06 | 0 |
|  28/03/2022 05:55:06 | 0 |
|  28/03/2022 06:25:06 | 0 |
|  28/03/2022 06:55:06 | 0 |
|  28/03/2022 07:25:06 | 0 |
|  28/03/2022 07:55:06 | 0 |
|  28/03/2022 08:25:06 | 0 |
|  28/03/2022 08:55:06 | 0 |
|  28/03/2022 09:25:06 | 0 |
|  28/03/2022 09:55:06 | 0 |
|  28/03/2022 10:25:06 | 0 |
|  28/03/2022 10:55:06 | 0 |
|  28/03/2022 11:25:06 | 0 |
|  28/03/2022 11:55:06 | 0 |
|  28/03/2022 12:25:06 | 0 |
|  28/03/2022 12:55:06 | 0 |
|  28/03/2022 13:25:06 | 0 |
|  28/03/2022 13:55:06 | 0 |
|  28/03/2022 14:25:06 | 0 |
|  28/03/2022 14:55:06 | 0 |
|  28/03/2022 15:25:06 | 0 |
|  28/03/2022 15:55:06 | 0 |
|  28/03/2022 16:25:06 | 0 |
|  28/03/2022 16:55:06 | 0 |
|  28/03/2022 17:25:06 | 0 |
|  28/03/2022 17:55:06 | 0 |
|  28/03/2022 18:25:06 | 0 |
|  28/03/2022 18:55:06 | 0 |
|  28/03/2022 19:25:06 | 0 |
|  28/03/2022 19:55:06 | 0 |
|  28/03/2022 20:25:06 | 0 |
|  28/03/2022 20:55:06 | 0 |
|  28/03/2022 21:25:06 | 0 |
|  28/03/2022 21:55:06 | 0 |
|  28/03/2022 22:25:06 | 0 |
|  28/03/2022 22:55:06 | 0 |
|  28/03/2022 23:25:06 | 0 |
|  28/03/2022 23:55:06 | 0 |
|  29/03/2022 00:25:06 | 0 |
|  29/03/2022 00:55:06 | 0 |
|  29/03/2022 01:25:06 | 0 |
|  29/03/2022 01:55:06 | 0 |
|  29/03/2022 02:25:06 | 0 |
|  29/03/2022 02:55:06 | 0 |
|  29/03/2022 03:25:06 | 0 |
|  29/03/2022 03:55:06 | 0 |
|  29/03/2022 04:25:06 | 0 |
|  29/03/2022 04:55:06 | 0 |
|  29/03/2022 05:25:06 | 0 |
|  29/03/2022 05:55:06 | 0 |
|  29/03/2022 06:25:06 | 0 |
|  29/03/2022 06:55:06 | 0 |
|  29/03/2022 07:25:06 | 0 |
|  29/03/2022 07:55:06 | 0 |
|  29/03/2022 08:25:06 | 0 |
|  29/03/2022 08:55:06 | 0 |
|  29/03/2022 09:25:06 | 0 |
|  29/03/2022 09:55:06 | 0 |
|  29/03/2022 10:25:06 | 0.3 |
|  29/03/2022 10:55:06 | 0.3 |
|  29/03/2022 11:25:06 | 0 |
|  29/03/2022 11:55:06 | 0 |
|  29/03/2022 12:25:06 | 0 |
|  29/03/2022 12:55:06 | 0 |
|  29/03/2022 13:25:06 | 0 |
|  29/03/2022 13:55:06 | 0 |
|  29/03/2022 14:25:06 | 0 |
|  29/03/2022 14:55:06 | 0 |
|  29/03/2022 15:25:06 | 0 |
|  29/03/2022 15:55:06 | 0 |
|  29/03/2022 16:25:06 | 0 |
|  29/03/2022 16:55:06 | 0 |
|  29/03/2022 17:25:06 | 0 |
|  29/03/2022 17:55:06 | 0 |
|  29/03/2022 18:25:06 | 0 |
|  29/03/2022 18:55:06 | 0 |
|  29/03/2022 19:25:06 | 0 |
|  29/03/2022 19:55:06 | 0.3 |
|  29/03/2022 20:25:06 | 0.3 |
|  29/03/2022 20:55:06 | 0.3 |
|  29/03/2022 21:25:06 | 0 |
|  29/03/2022 21:55:06 | 0 |
|  29/03/2022 22:25:06 | 0 |
|  29/03/2022 22:55:06 | 0 |
|  29/03/2022 23:25:06 | 0 |
|  29/03/2022 23:55:06 | 0 |
|  30/03/2022 00:25:06 | 0 |
|  30/03/2022 00:55:06 | 0 |
|  30/03/2022 01:25:06 | 0 |
|  30/03/2022 01:55:06 | 0 |
|  30/03/2022 02:25:06 | 0 |
|  30/03/2022 02:55:06 | 0 |
|  30/03/2022 03:25:06 | 0 |
|  30/03/2022 03:55:06 | 0 |
|  30/03/2022 04:25:06 | 0 |
|  30/03/2022 04:55:06 | 0 |
|  30/03/2022 05:25:06 | 0 |
|  30/03/2022 05:55:06 | 0 |
|  30/03/2022 06:25:06 | 0 |
|  30/03/2022 06:55:06 | 0 |
|  30/03/2022 07:25:06 | 0 |
|  30/03/2022 07:55:06 | 0 |
|  30/03/2022 08:25:06 | 0 |
|  30/03/2022 08:55:06 | 0 |
|  30/03/2022 09:25:06 | 0 |
|  30/03/2022 09:55:06 | 0 |
|  30/03/2022 10:25:06 | 0 |
|  30/03/2022 10:55:06 | 0 |
|  30/03/2022 11:25:06 | 0 |
|  30/03/2022 11:55:06 | 0 |
|  30/03/2022 12:25:06 | 0 |
|  30/03/2022 12:55:06 | 0 |
|  30/03/2022 13:25:06 | 0 |
|  30/03/2022 13:55:06 | 0 |
|  30/03/2022 14:25:06 | 0 |
|  30/03/2022 14:55:06 | 0 |
|  30/03/2022 15:25:06 | 0 |
|  30/03/2022 15:55:06 | 0 |
|  30/03/2022 16:25:06 | 0.3 |
|  30/03/2022 16:55:06 | 0.3 |
|  30/03/2022 17:25:06 | 0 |
|  30/03/2022 17:55:06 | 0 |
|  30/03/2022 18:25:06 | 0 |
|  30/03/2022 18:55:06 | 0 |
|  30/03/2022 19:25:06 | 0 |
|  30/03/2022 19:55:06 | 0 |
|  30/03/2022 20:25:06 | 0 |
|  30/03/2022 20:55:06 | 0 |
|  30/03/2022 21:25:06 | 0 |
|  30/03/2022 21:55:06 | 0 |
|  30/03/2022 22:25:06 | 0 |
|  30/03/2022 22:55:06 | 0 |
|  30/03/2022 23:25:06 | 0 |
|  30/03/2022 23:55:06 | 0 |
|  31/03/2022 00:25:06 | 0 |
|  31/03/2022 00:55:06 | 0 |
|  31/03/2022 01:25:06 | 0 |
|  31/03/2022 01:55:06 | 0 |
|  31/03/2022 02:25:06 | 0 |
|  31/03/2022 02:55:06 | 0 |
|  31/03/2022 03:25:06 | 0 |
|  31/03/2022 03:55:06 | 0 |
|  31/03/2022 04:25:06 | 0 |
|  31/03/2022 04:55:06 | 0 |
|  31/03/2022 05:25:06 | 0 |
|  31/03/2022 05:55:06 | 0 |
|  31/03/2022 06:25:06 | 0 |
|  31/03/2022 06:55:06 | 0 |
|  31/03/2022 07:25:06 | 0 |
|  31/03/2022 07:55:06 | 0 |
|  31/03/2022 08:25:06 | 0 |
|  31/03/2022 08:55:06 | 0 |
|  31/03/2022 09:25:06 | 0 |
|  31/03/2022 09:55:06 | 0 |
|  31/03/2022 10:25:06 | 0 |
|  31/03/2022 10:55:06 | 0 |
|  31/03/2022 11:25:06 | 0 |
|  31/03/2022 11:55:06 | 0 |
|  31/03/2022 12:25:06 | 0 |
|  31/03/2022 12:55:06 | 0 |
|  31/03/2022 13:25:06 | 0 |
|  31/03/2022 13:55:06 | 0 |
|  31/03/2022 14:25:06 | 0 |
|  31/03/2022 14:55:06 | 0 |
|  31/03/2022 15:25:06 | 0 |
|  31/03/2022 15:55:06 | 0 |
|  31/03/2022 16:25:06 | 0 |
|  31/03/2022 16:55:06 | 0 |
|  31/03/2022 17:25:06 | 0 |
|  31/03/2022 17:55:06 | 0 |
|  31/03/2022 18:25:06 | 0 |
|  31/03/2022 18:55:06 | 0 |
|  31/03/2022 19:25:06 | 0 |
|  31/03/2022 19:55:06 | 0 |
|  31/03/2022 20:25:06 | 0 |
|  31/03/2022 20:55:06 | 0 |
|  31/03/2022 21:25:06 | 0 |
|  31/03/2022 21:55:06 | 0 |
|  31/03/2022 22:25:06 | 0 |
|  31/03/2022 22:55:06 | 0 |
|  31/03/2022 23:25:06 | 0 |
|  31/03/2022 23:55:06 | 0 |